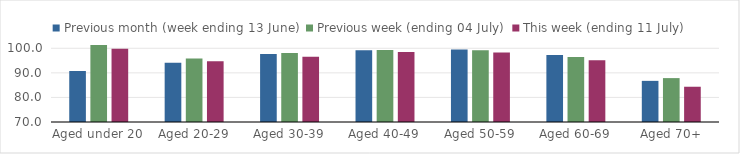
| Category | Previous month (week ending 13 June) | Previous week (ending 04 July) | This week (ending 11 July) |
|---|---|---|---|
| Aged under 20 | 90.754 | 101.321 | 99.811 |
| Aged 20-29 | 94.152 | 95.818 | 94.681 |
| Aged 30-39 | 97.682 | 98.036 | 96.519 |
| Aged 40-49 | 99.184 | 99.353 | 98.442 |
| Aged 50-59 | 99.503 | 99.202 | 98.298 |
| Aged 60-69 | 97.303 | 96.43 | 95.177 |
| Aged 70+ | 86.742 | 87.865 | 84.351 |